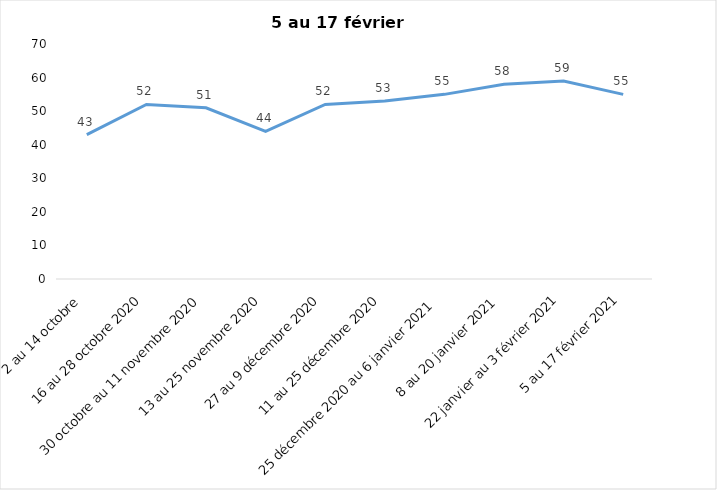
| Category | Toujours aux trois mesures |
|---|---|
| 2 au 14 octobre  | 43 |
| 16 au 28 octobre 2020 | 52 |
| 30 octobre au 11 novembre 2020 | 51 |
| 13 au 25 novembre 2020 | 44 |
| 27 au 9 décembre 2020 | 52 |
| 11 au 25 décembre 2020 | 53 |
| 25 décembre 2020 au 6 janvier 2021 | 55 |
| 8 au 20 janvier 2021 | 58 |
| 22 janvier au 3 février 2021 | 59 |
| 5 au 17 février 2021 | 55 |